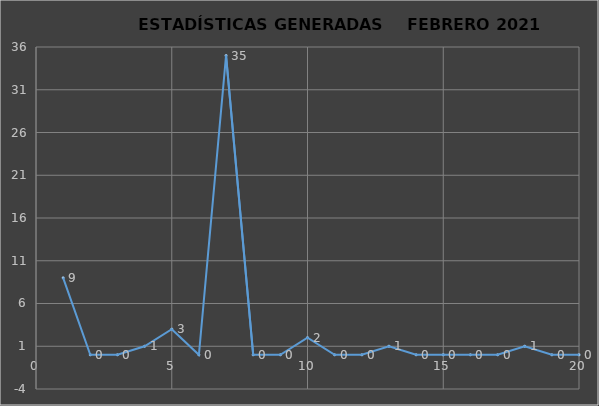
| Category |                   ESTADÍSTICAS GENERADAS     PERÍODO FEBRERO 2021 CANTIDAD |
|---|---|
| 0 | 9 |
| 1 | 0 |
| 2 | 0 |
| 3 | 1 |
| 4 | 3 |
| 5 | 0 |
| 6 | 35 |
| 7 | 0 |
| 8 | 0 |
| 9 | 2 |
| 10 | 0 |
| 11 | 0 |
| 12 | 1 |
| 13 | 0 |
| 14 | 0 |
| 15 | 0 |
| 16 | 0 |
| 17 | 1 |
| 18 | 0 |
| 19 | 0 |